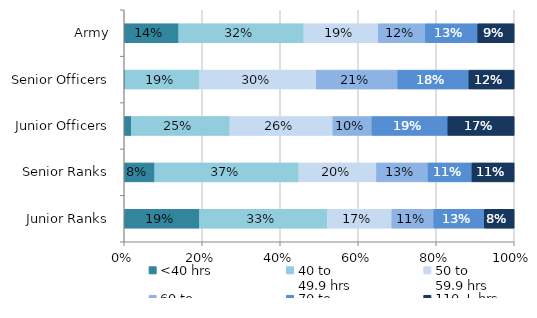
| Category | <40 hrs | 40 to 
49.9 hrs | 50 to 
59.9 hrs | 60 to 
69.9 hrs | 70 to 
109.9 hrs | 110 + hrs |
|---|---|---|---|---|---|---|
| Army | 0.14 | 0.321 | 0.191 | 0.121 | 0.134 | 0.093 |
| Senior Officers | 0.002 | 0.19 | 0.3 | 0.209 | 0.182 | 0.116 |
| Junior Officers | 0.018 | 0.253 | 0.265 | 0.1 | 0.195 | 0.17 |
| Senior Ranks | 0.078 | 0.369 | 0.2 | 0.132 | 0.113 | 0.108 |
| Junior Ranks | 0.193 | 0.328 | 0.166 | 0.108 | 0.129 | 0.077 |